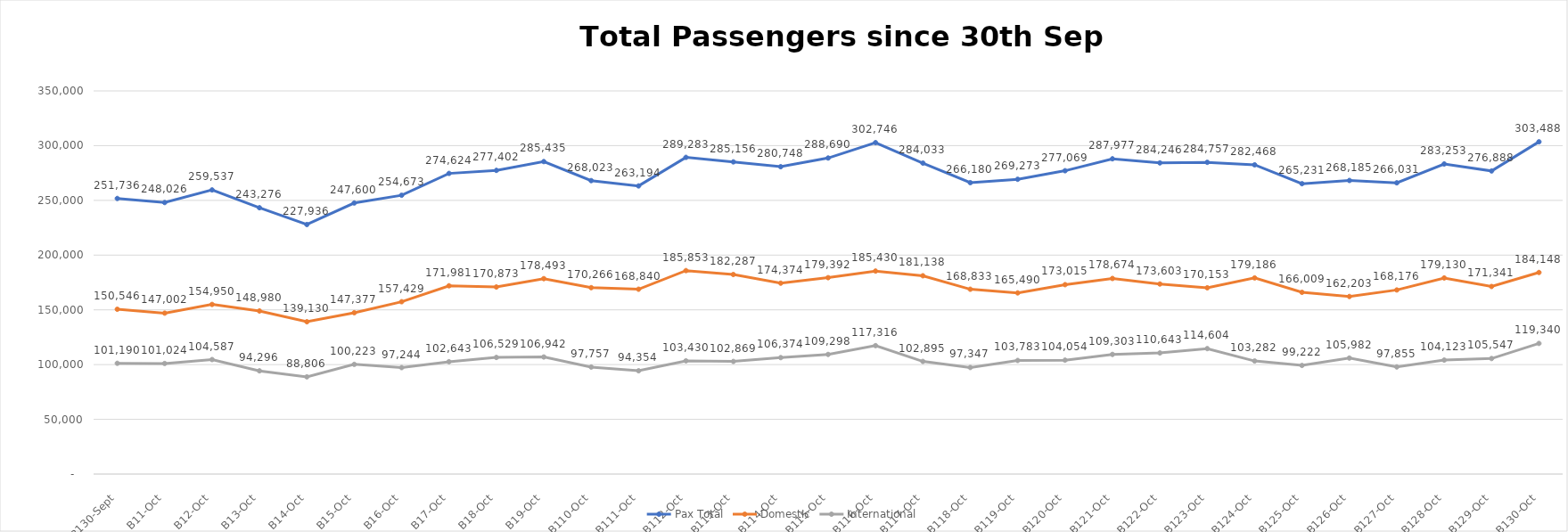
| Category | Pax Total |  Domestic  |  International  |
|---|---|---|---|
| 2022-09-30 | 251736 | 150546 | 101190 |
| 2022-10-01 | 248026 | 147002 | 101024 |
| 2022-10-02 | 259537 | 154950 | 104587 |
| 2022-10-03 | 243276 | 148980 | 94296 |
| 2022-10-04 | 227936 | 139130 | 88806 |
| 2022-10-05 | 247600 | 147377 | 100223 |
| 2022-10-06 | 254673 | 157429 | 97244 |
| 2022-10-07 | 274624 | 171981 | 102643 |
| 2022-10-08 | 277402 | 170873 | 106529 |
| 2022-10-09 | 285435 | 178493 | 106942 |
| 2022-10-10 | 268023 | 170266 | 97757 |
| 2022-10-11 | 263194 | 168840 | 94354 |
| 2022-10-12 | 289283 | 185853 | 103430 |
| 2022-10-13 | 285156 | 182287 | 102869 |
| 2022-10-14 | 280748 | 174374 | 106374 |
| 2022-10-15 | 288690 | 179392 | 109298 |
| 2022-10-16 | 302746 | 185430 | 117316 |
| 2022-10-17 | 284033 | 181138 | 102895 |
| 2022-10-18 | 266180 | 168833 | 97347 |
| 2022-10-19 | 269273 | 165490 | 103783 |
| 2022-10-20 | 277069 | 173015 | 104054 |
| 2022-10-21 | 287977 | 178674 | 109303 |
| 2022-10-22 | 284246 | 173603 | 110643 |
| 2022-10-23 | 284757 | 170153 | 114604 |
| 2022-10-24 | 282468 | 179186 | 103282 |
| 2022-10-25 | 265231 | 166009 | 99222 |
| 2022-10-26 | 268185 | 162203 | 105982 |
| 2022-10-27 | 266031 | 168176 | 97855 |
| 2022-10-28 | 283253 | 179130 | 104123 |
| 2022-10-29 | 276888 | 171341 | 105547 |
| 2022-10-30 | 303488 | 184148 | 119340 |